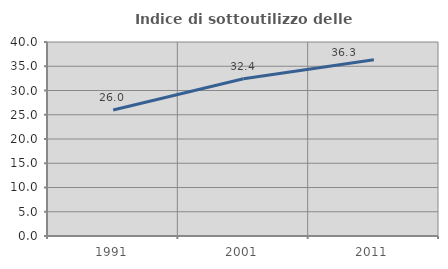
| Category | Indice di sottoutilizzo delle abitazioni  |
|---|---|
| 1991.0 | 25.994 |
| 2001.0 | 32.439 |
| 2011.0 | 36.324 |